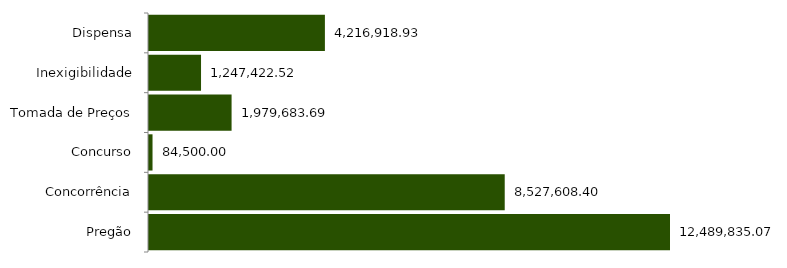
| Category | Series 0 |
|---|---|
| Pregão | 12489835.07 |
| Concorrência | 8527608.4 |
| Concurso | 84500 |
| Tomada de Preços | 1979683.69 |
| Inexigibilidade | 1247422.52 |
| Dispensa | 4216918.93 |